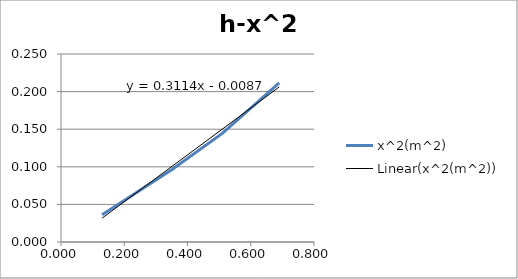
| Category | x^2(m^2) |
|---|---|
| 0.69 | 0.212 |
| 0.51 | 0.144 |
| 0.35 | 0.096 |
| 0.13 | 0.036 |